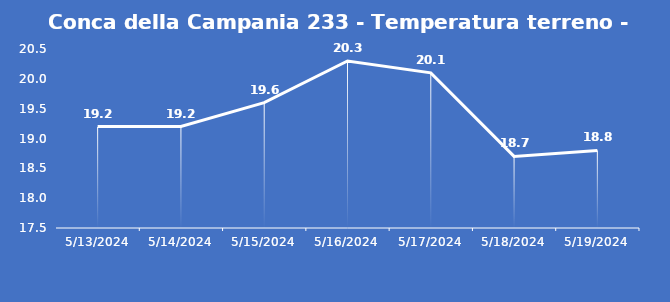
| Category | Conca della Campania 233 - Temperatura terreno - Grezzo (°C) |
|---|---|
| 5/13/24 | 19.2 |
| 5/14/24 | 19.2 |
| 5/15/24 | 19.6 |
| 5/16/24 | 20.3 |
| 5/17/24 | 20.1 |
| 5/18/24 | 18.7 |
| 5/19/24 | 18.8 |